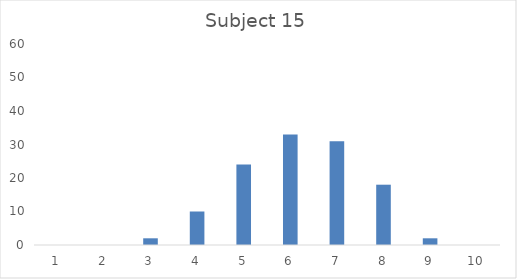
| Category | Frequency |
|---|---|
| 0 | 0 |
| 1 | 0 |
| 2 | 2 |
| 3 | 10 |
| 4 | 24 |
| 5 | 33 |
| 6 | 31 |
| 7 | 18 |
| 8 | 2 |
| 9 | 0 |